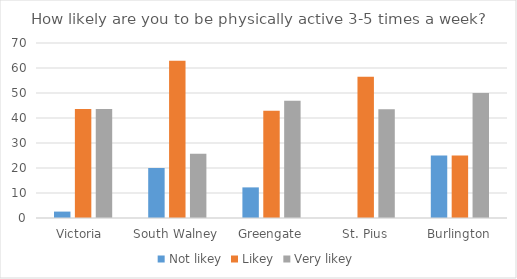
| Category | Not likey | Likey | Very likey |
|---|---|---|---|
| Victoria  | 2.564 | 43.59 | 43.59 |
| South Walney | 20 | 62.857 | 25.714 |
| Greengate | 12.245 | 42.857 | 46.939 |
| St. Pius | 0 | 56.522 | 43.478 |
| Burlington | 25 | 25 | 50 |